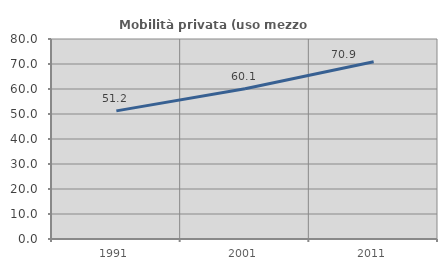
| Category | Mobilità privata (uso mezzo privato) |
|---|---|
| 1991.0 | 51.243 |
| 2001.0 | 60.073 |
| 2011.0 | 70.879 |